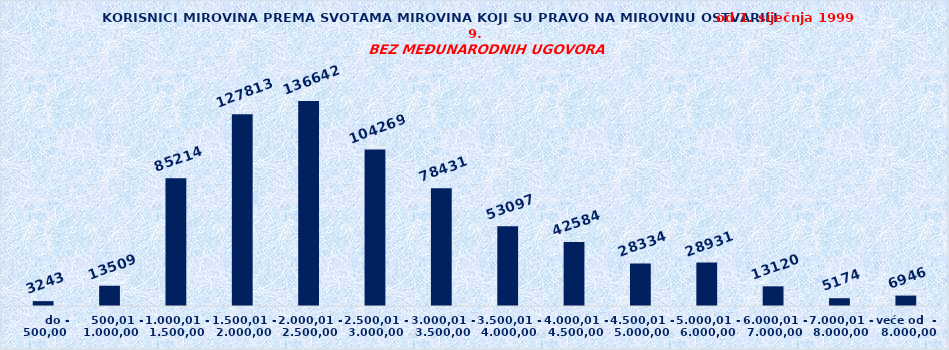
| Category | Series 0 |
|---|---|
|       do - 500,00 | 3243 |
|    500,01 - 1.000,00 | 13509 |
| 1.000,01 - 1.500,00 | 85214 |
| 1.500,01 - 2.000,00 | 127813 |
| 2.000,01 - 2.500,00 | 136642 |
| 2.500,01 - 3.000,00 | 104269 |
| 3.000,01 - 3.500,00 | 78431 |
| 3.500,01 - 4.000,00 | 53097 |
| 4.000,01 - 4.500,00 | 42584 |
| 4.500,01 - 5.000,00 | 28334 |
| 5.000,01 - 6.000,00 | 28931 |
| 6.000,01 - 7.000,00 | 13120 |
| 7.000,01 - 8.000,00 | 5174 |
| veće od  -  8.000,00 | 6946 |